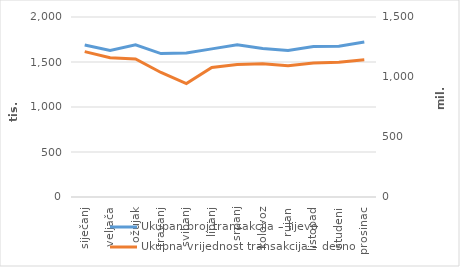
| Category | Ukupan broj transakcija – lijevo |
|---|---|
| siječanj | 1689658 |
| veljača | 1628932 |
| ožujak | 1690846 |
| travanj | 1593917 |
| svibanj | 1601244 |
| lipanj | 1645690 |
| srpanj | 1691157 |
| kolovoz | 1649626 |
| rujan | 1627483 |
| listopad | 1672488 |
| studeni | 1675992 |
| prosinac | 1722990 |